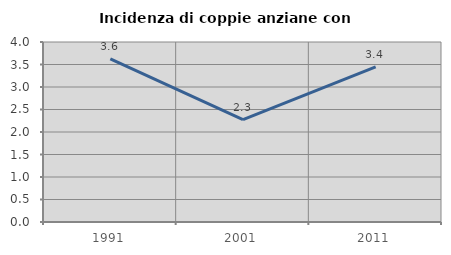
| Category | Incidenza di coppie anziane con figli |
|---|---|
| 1991.0 | 3.627 |
| 2001.0 | 2.273 |
| 2011.0 | 3.448 |